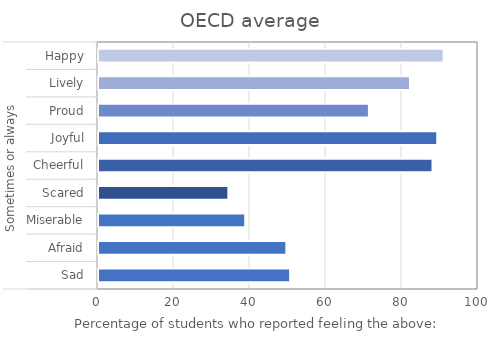
| Category | OECD average |
|---|---|
| 0 | 90.97 |
| 1 | 82.106 |
| 2 | 71.293 |
| 3 | 89.269 |
| 4 | 88.026 |
| 5 | 34.302 |
| 6 | 38.739 |
| 7 | 49.564 |
| 8 | 50.556 |